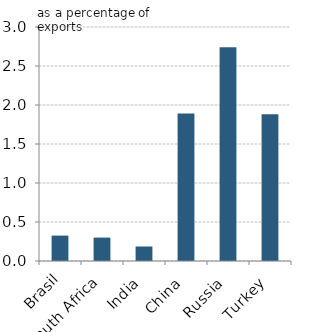
| Category | Series 0 |
|---|---|
| Brasil | 0.326 |
| South Africa | 0.3 |
| India | 0.186 |
| China | 1.892 |
| Russia | 2.74 |
| Turkey | 1.881 |